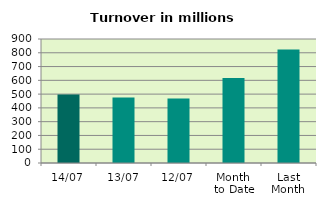
| Category | Series 0 |
|---|---|
| 14/07 | 497.973 |
| 13/07 | 474.921 |
| 12/07 | 468.696 |
| Month 
to Date | 616.434 |
| Last
Month | 824.124 |